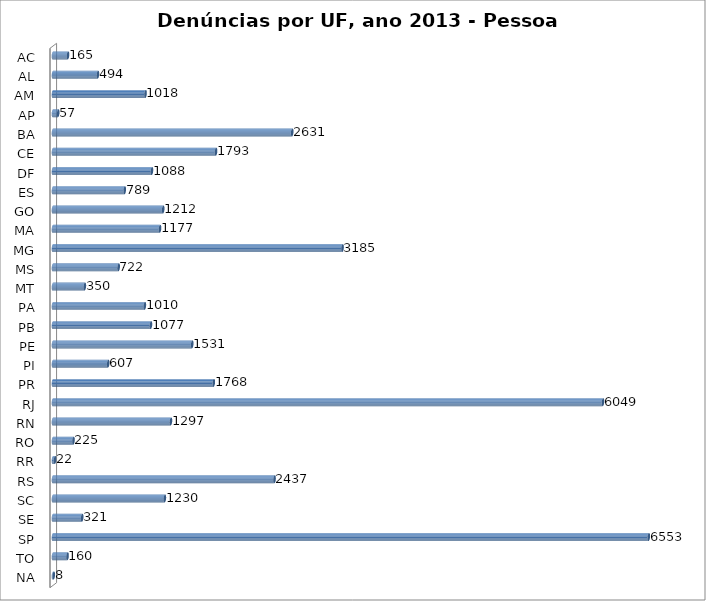
| Category | Series 0 |
|---|---|
| AC | 165 |
| AL | 494 |
| AM | 1018 |
| AP | 57 |
| BA | 2631 |
| CE | 1793 |
| DF | 1088 |
| ES | 789 |
| GO | 1212 |
| MA | 1177 |
| MG | 3185 |
| MS | 722 |
| MT | 350 |
| PA | 1010 |
| PB | 1077 |
| PE | 1531 |
| PI | 607 |
| PR | 1768 |
| RJ | 6049 |
| RN | 1297 |
| RO | 225 |
| RR | 22 |
| RS | 2437 |
| SC | 1230 |
| SE | 321 |
| SP | 6553 |
| TO | 160 |
| NA | 8 |